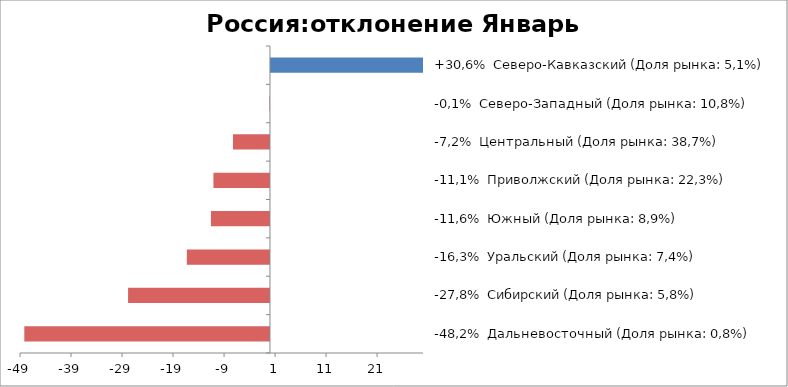
| Category | Россия:отклонение Январь 2016-2015 |
|---|---|
| -48,2%  Дальневосточный (Доля рынка: 0,8%) | -48.157 |
| -27,8%  Сибирский (Доля рынка: 5,8%) | -27.815 |
| -16,3%  Уральский (Доля рынка: 7,4%) | -16.297 |
| -11,6%  Южный (Доля рынка: 8,9%) | -11.563 |
| -11,1%  Приволжский (Доля рынка: 22,3%) | -11.08 |
| -7,2%  Центральный (Доля рынка: 38,7%) | -7.249 |
| -0,1%  Северо-Западный (Доля рынка: 10,8%) | -0.092 |
| +30,6%  Северо-Кавказский (Доля рынка: 5,1%) | 30.57 |